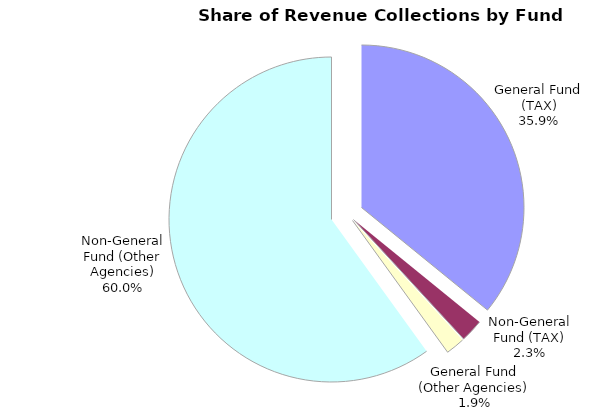
| Category | Series 0 |
|---|---|
| General Fund (TAX) | 0.359 |
| Non-General Fund (TAX) | 0.023 |
| General Fund (Other Agencies) | 0.019 |
| Non-General Fund (Other Agencies) | 0.6 |